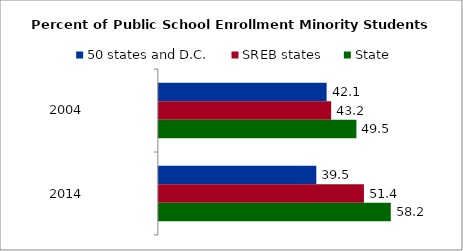
| Category | 50 states and D.C. | SREB states | State |
|---|---|---|---|
| 2004.0 | 42.065 | 43.203 | 49.534 |
| 2014.0 | 39.478 | 51.418 | 58.15 |